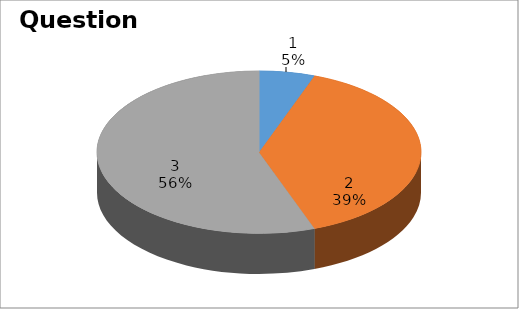
| Category | Series 0 |
|---|---|
| 0 | 1 |
| 1 | 7 |
| 2 | 10 |